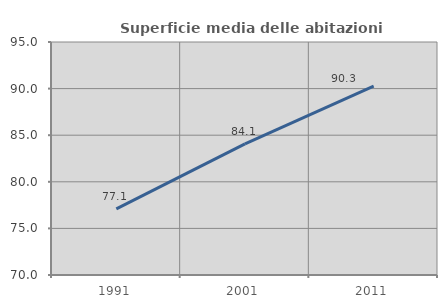
| Category | Superficie media delle abitazioni occupate |
|---|---|
| 1991.0 | 77.089 |
| 2001.0 | 84.077 |
| 2011.0 | 90.275 |